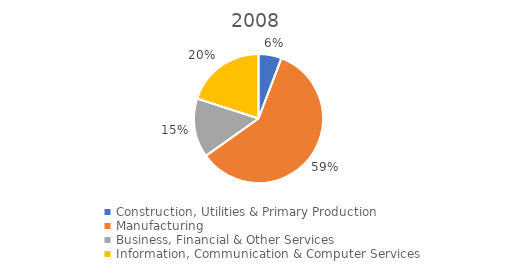
| Category | Series 0 |
|---|---|
| Construction, Utilities & Primary Production  | 18249 |
| Manufacturing  | 187373 |
| Business, Financial & Other Services | 46742 |
| Information, Communication & Computer Services | 63106 |